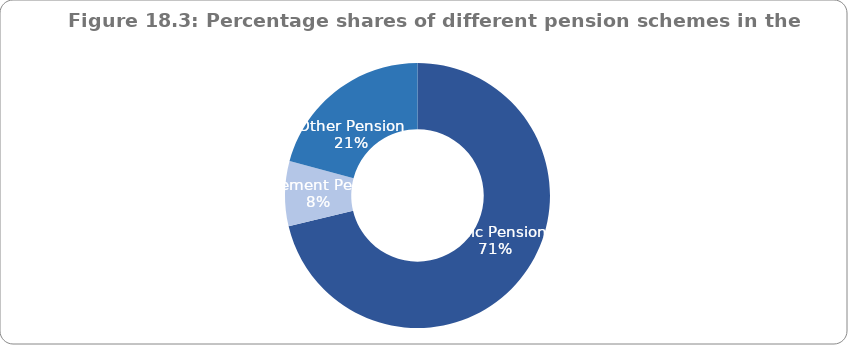
| Category | Series 0 |
|---|---|
| Basic Pension | 71.273 |
| Retirement Pension | 7.917 |
| Other Pension | 20.81 |